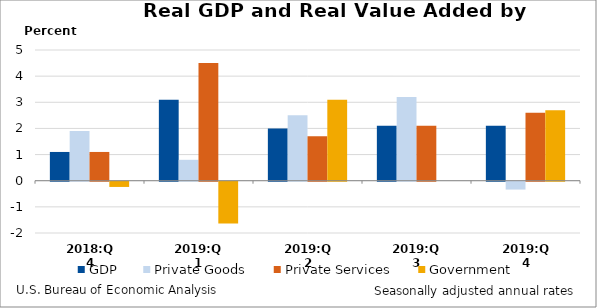
| Category | GDP | Private Goods | Private Services | Government |
|---|---|---|---|---|
| 2018:Q4 | 1.1 | 1.9 | 1.1 | -0.2 |
| 2019:Q1 | 3.1 | 0.8 | 4.5 | -1.6 |
| 2019:Q2 | 2 | 2.5 | 1.7 | 3.1 |
| 2019:Q3 | 2.1 | 3.2 | 2.1 | 0 |
| 2019:Q4 | 2.1 | -0.3 | 2.6 | 2.7 |